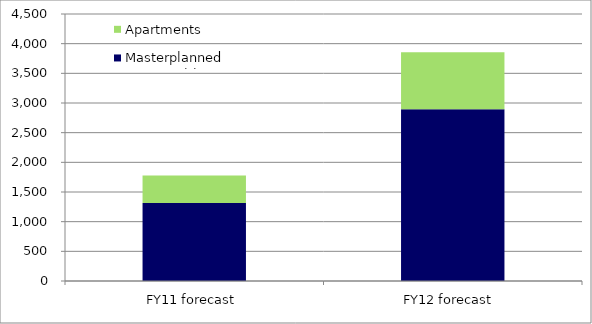
| Category | Masterplanned Communities | Apartments |
|---|---|---|
| FY11 forecast | 1316 | 460 |
| FY12 forecast  | 2895 | 959 |